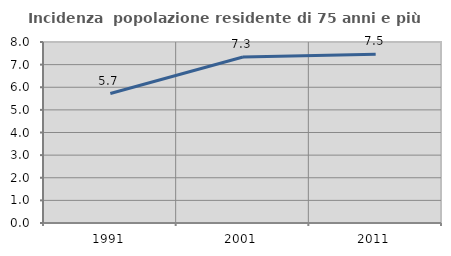
| Category | Incidenza  popolazione residente di 75 anni e più |
|---|---|
| 1991.0 | 5.724 |
| 2001.0 | 7.339 |
| 2011.0 | 7.463 |